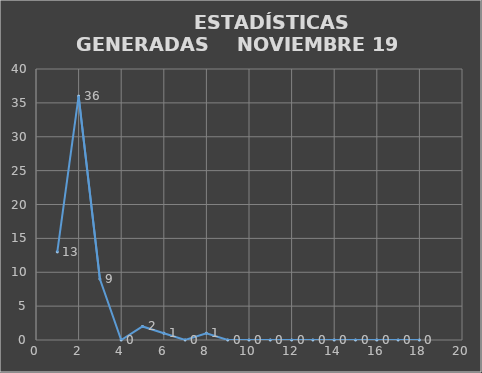
| Category |                   ESTADÍSTICAS GENERADAS  |
|---|---|
| 0 | 13 |
| 1 | 36 |
| 2 | 9 |
| 3 | 0 |
| 4 | 2 |
| 5 | 1 |
| 6 | 0 |
| 7 | 1 |
| 8 | 0 |
| 9 | 0 |
| 10 | 0 |
| 11 | 0 |
| 12 | 0 |
| 13 | 0 |
| 14 | 0 |
| 15 | 0 |
| 16 | 0 |
| 17 | 0 |